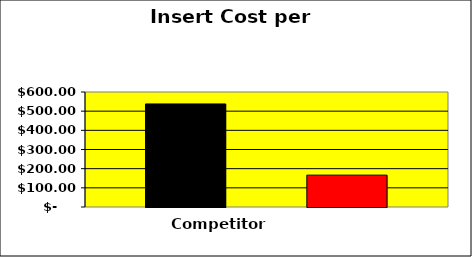
| Category | Competitor | Toshiba | Series 2 |
|---|---|---|---|
| 0 | 537.75 |  | 166.25 |